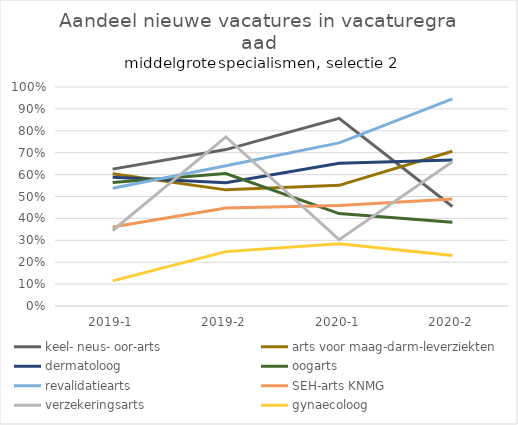
| Category | keel- neus- oor-arts | arts voor maag-darm-leverziekten | dermatoloog | oogarts | revalidatiearts | SEH-arts KNMG | verzekeringsarts | gynaecoloog |
|---|---|---|---|---|---|---|---|---|
| 2019-1 | 0.625 | 0.604 | 0.588 | 0.563 | 0.537 | 0.36 | 0.345 | 0.115 |
| 2019-2 | 0.714 | 0.53 | 0.562 | 0.605 | 0.64 | 0.447 | 0.772 | 0.248 |
| 2020-1 | 0.857 | 0.551 | 0.652 | 0.422 | 0.745 | 0.459 | 0.303 | 0.284 |
| 2020-2 | 0.455 | 0.707 | 0.667 | 0.382 | 0.946 | 0.489 | 0.659 | 0.23 |